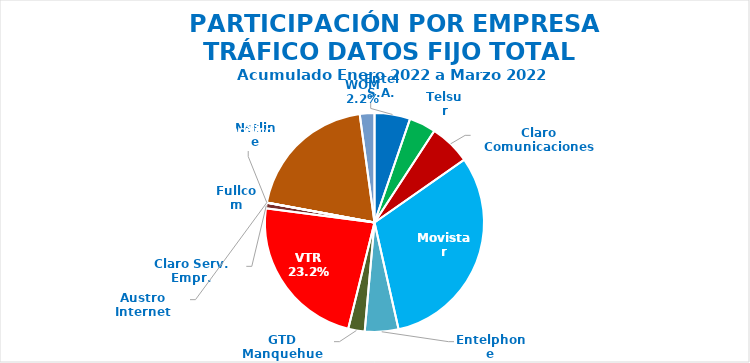
| Category | Series 0 |
|---|---|
| Entel S.A. | 293811.026 |
| Telsur | 220412.136 |
| Claro Comunicaciones | 339451.509 |
| Movistar | 1742765.326 |
| Entelphone | 277197.958 |
| GTD Manquehue | 135776.09 |
| VTR | 1296832.13 |
| Claro Serv. Empr. | 46077.711 |
| Fullcom | 102.747 |
| Netline | 1005.853 |
| Austro Internet | 49.626 |
| Mundo Pacífico | 1113188.379 |
| WOM | 120895.563 |